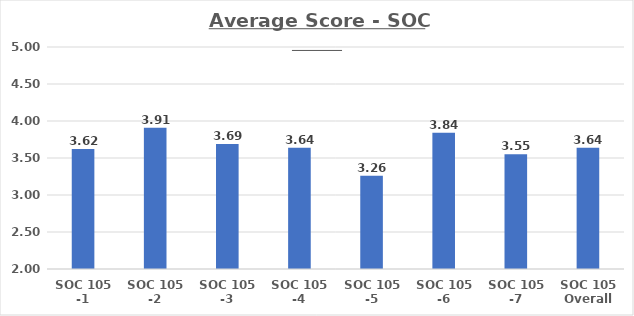
| Category | Average Score - SOC 105s |
|---|---|
| SOC 105 -1 | 3.62 |
| SOC 105 -2 | 3.91 |
| SOC 105 -3 | 3.69 |
| SOC 105 -4 | 3.64 |
| SOC 105 -5 | 3.26 |
| SOC 105 -6 | 3.84 |
| SOC 105 -7 | 3.55 |
| SOC 105 Overall | 3.64 |